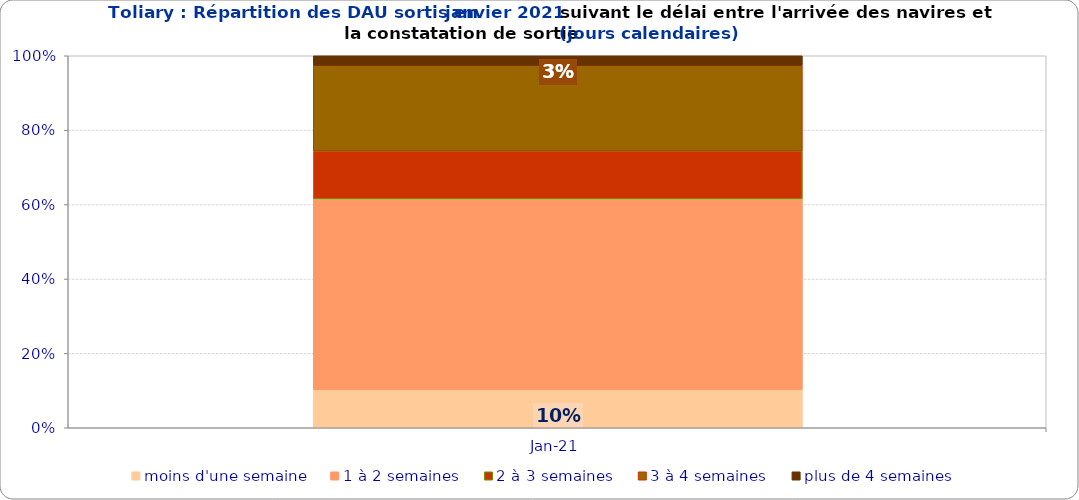
| Category | moins d'une semaine | 1 à 2 semaines | 2 à 3 semaines | 3 à 4 semaines | plus de 4 semaines |
|---|---|---|---|---|---|
| 2021-01-01 | 0.103 | 0.513 | 0.128 | 0.231 | 0.026 |